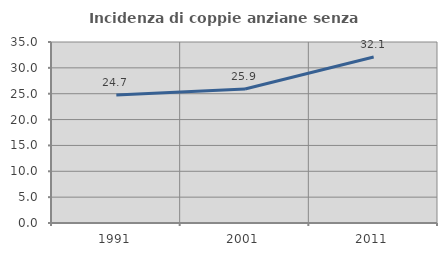
| Category | Incidenza di coppie anziane senza figli  |
|---|---|
| 1991.0 | 24.742 |
| 2001.0 | 25.926 |
| 2011.0 | 32.099 |